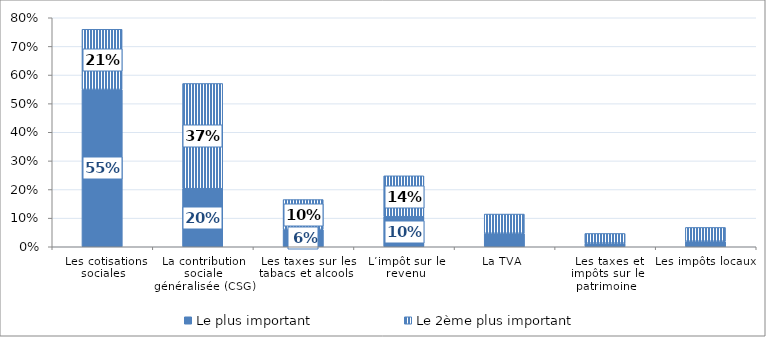
| Category | Le plus important | Le 2ème plus important |
|---|---|---|
|  Les cotisations sociales | 0.549 | 0.21 |
| La contribution sociale généralisée (CSG) | 0.203 | 0.368 |
|  Les taxes sur les tabacs et alcools | 0.06 | 0.105 |
| L’impôt sur le revenu | 0.105 | 0.143 |
| La TVA  | 0.047 | 0.067 |
|  Les taxes et impôts sur le patrimoine | 0.013 | 0.034 |
| Les impôts locaux | 0.019 | 0.048 |